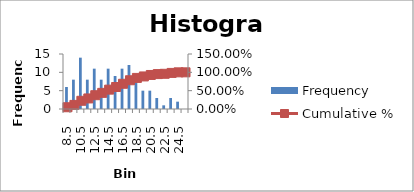
| Category | Frequency |
|---|---|
| 8.5 | 6 |
| 9.5 | 8 |
| 10.5 | 14 |
| 11.5 | 8 |
| 12.5 | 11 |
| 13.5 | 8 |
| 14.5 | 11 |
| 15.5 | 9 |
| 16.5 | 11 |
| 17.5 | 12 |
| 18.5 | 8 |
| 19.5 | 5 |
| 20.5 | 5 |
| 21.5 | 3 |
| 22.5 | 1 |
| 23.5 | 3 |
| 24.5 | 2 |
| More | 0 |